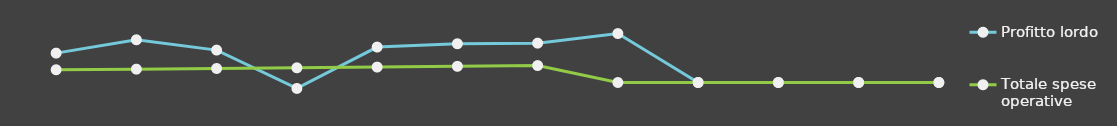
| Category | Profitto lordo | Totale spese operative |
|---|---|---|
| 0 | 25000 | 10841 |
| 1 | 36348 | 11367.25 |
| 2 | 27562 | 11919.82 |
| 3 | -5059.5 | 12500.01 |
| 4 | 30153.18 | 13109.21 |
| 5 | 32964.45 | 13748.86 |
| 6 | 33502.87 | 14420.51 |
| 7 | 41646 | 0 |
| 8 | 0 | 0 |
| 9 | 0 | 0 |
| 10 | 0 | 0 |
| 11 | 0 | 0 |